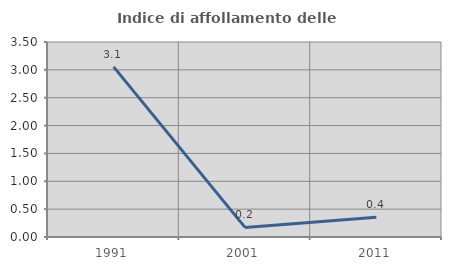
| Category | Indice di affollamento delle abitazioni  |
|---|---|
| 1991.0 | 3.053 |
| 2001.0 | 0.172 |
| 2011.0 | 0.355 |